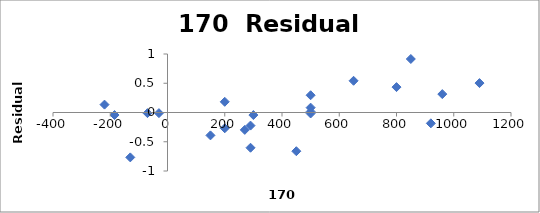
| Category | Series 0 |
|---|---|
| 290.0 | -0.602 |
| -130.0 | -0.767 |
| -70.0 | -0.011 |
| -185.0 | -0.043 |
| -220.0 | 0.135 |
| 200.0 | 0.183 |
| 290.0 | -0.224 |
| 270.0 | -0.297 |
| 200.0 | -0.27 |
| 300.0 | -0.044 |
| -30.0 | -0.011 |
| 650.0 | 0.542 |
| 150.0 | -0.391 |
| 500.0 | 0.295 |
| 920.0 | -0.185 |
| 450.0 | -0.662 |
| 500.0 | 0.083 |
| 500.0 | 0.015 |
| 960.0 | 0.315 |
| 500.0 | -0.017 |
| 850.0 | 0.915 |
| 800.0 | 0.434 |
| 1090.0 | 0.503 |